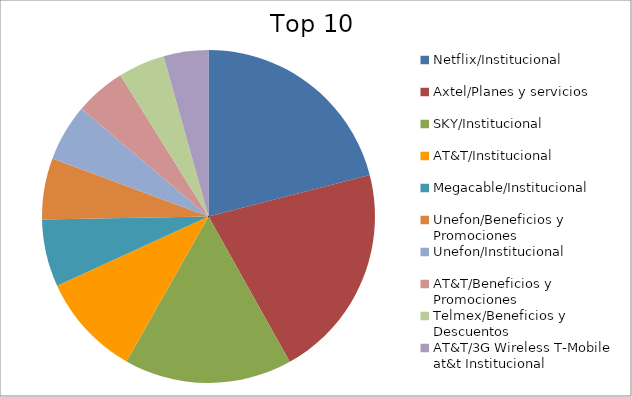
| Category | Series 0 |
|---|---|
| Netflix/Institucional | 16.43 |
| Axtel/Planes y servicios | 16.36 |
| SKY/Institucional | 12.77 |
| AT&T/Institucional | 7.81 |
| Megacable/Institucional | 5.12 |
| Unefon/Beneficios y Promociones | 4.67 |
| Unefon/Institucional | 4.32 |
| AT&T/Beneficios y Promociones | 3.86 |
| Telmex/Beneficios y Descuentos | 3.55 |
| AT&T/3G Wireless T-Mobile at&t Institucional | 3.4 |